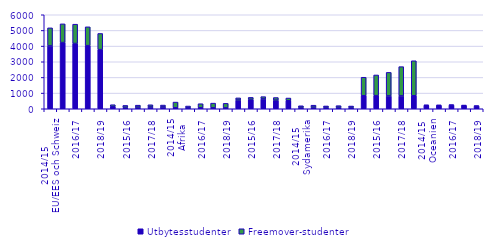
| Category | Utbytesstudenter | Freemover-studenter |
|---|---|---|
| 0 | 4012 | 1152 |
| 1 | 4224 | 1195 |
| 2 | 4165 | 1233 |
| 3 | 4028 | 1202 |
| 4 | 3774 | 1032 |
| 5 | 131 | 127 |
| 6 | 91 | 122 |
| 7 | 103 | 127 |
| 8 | 114 | 141 |
| 9 | 117 | 119 |
| 10 | 60 | 366 |
| 11 | 56 | 118 |
| 12 | 61 | 261 |
| 13 | 57 | 303 |
| 14 | 53 | 293 |
| 15 | 556 | 138 |
| 16 | 596 | 130 |
| 17 | 627 | 146 |
| 18 | 548 | 169 |
| 19 | 509 | 176 |
| 20 | 98 | 92 |
| 21 | 103 | 125 |
| 22 | 97 | 81 |
| 23 | 97 | 100 |
| 24 | 91 | 83 |
| 25 | 830 | 1181 |
| 26 | 835 | 1322 |
| 27 | 817 | 1505 |
| 28 | 818 | 1870 |
| 29 | 829 | 2235 |
| 30 | 220 | 13 |
| 31 | 215 | 14 |
| 32 | 233 | 10 |
| 33 | 205 | 13 |
| 34 | 170 | 12 |